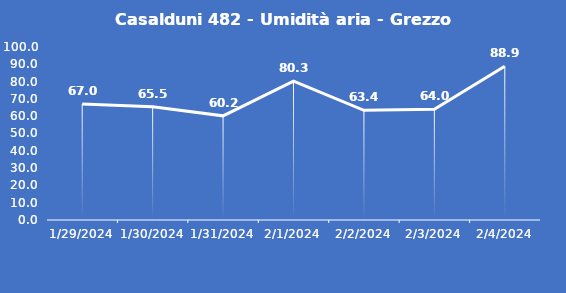
| Category | Casalduni 482 - Umidità aria - Grezzo (%) |
|---|---|
| 1/29/24 | 67 |
| 1/30/24 | 65.5 |
| 1/31/24 | 60.2 |
| 2/1/24 | 80.3 |
| 2/2/24 | 63.4 |
| 2/3/24 | 64 |
| 2/4/24 | 88.9 |